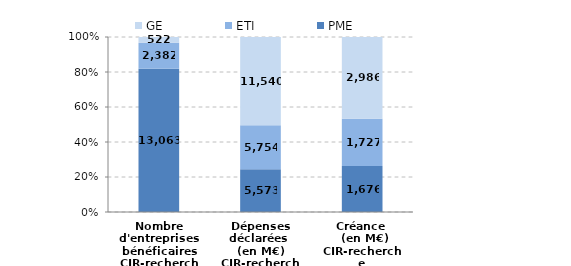
| Category | PME | ETI | GE |
|---|---|---|---|
| Nombre d'entreprises bénéficaires
CIR-recherche | 13063 | 2382 | 522 |
| Dépenses déclarées 
(en M€)
CIR-recherche | 5573.38 | 5753.82 | 11539.68 |
| Créance 
 (en M€)
CIR-recherche | 1675.86 | 1727 | 2985.52 |